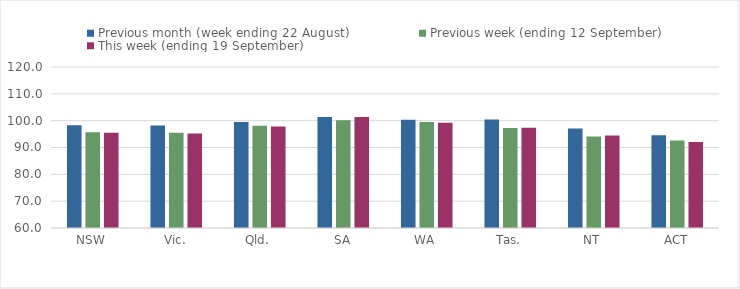
| Category | Previous month (week ending 22 August) | Previous week (ending 12 September) | This week (ending 19 September) |
|---|---|---|---|
| NSW | 98.27 | 95.69 | 95.52 |
| Vic. | 98.16 | 95.53 | 95.18 |
| Qld. | 99.47 | 98.1 | 97.86 |
| SA | 101.33 | 100.19 | 101.34 |
| WA | 100.31 | 99.47 | 99.25 |
| Tas. | 100.39 | 97.26 | 97.33 |
| NT | 97.05 | 94.09 | 94.47 |
| ACT | 94.53 | 92.61 | 92.07 |